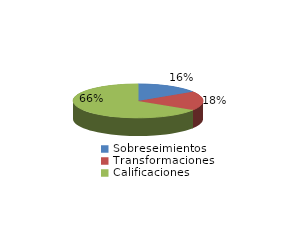
| Category | Series 0 |
|---|---|
| Sobreseimientos | 559 |
| Transformaciones | 639 |
| Calificaciones | 2323 |